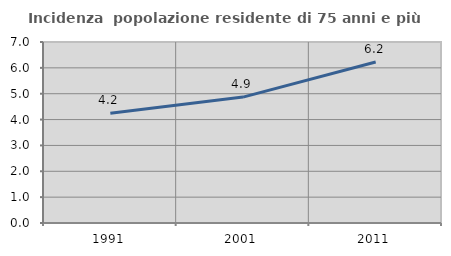
| Category | Incidenza  popolazione residente di 75 anni e più |
|---|---|
| 1991.0 | 4.241 |
| 2001.0 | 4.869 |
| 2011.0 | 6.225 |